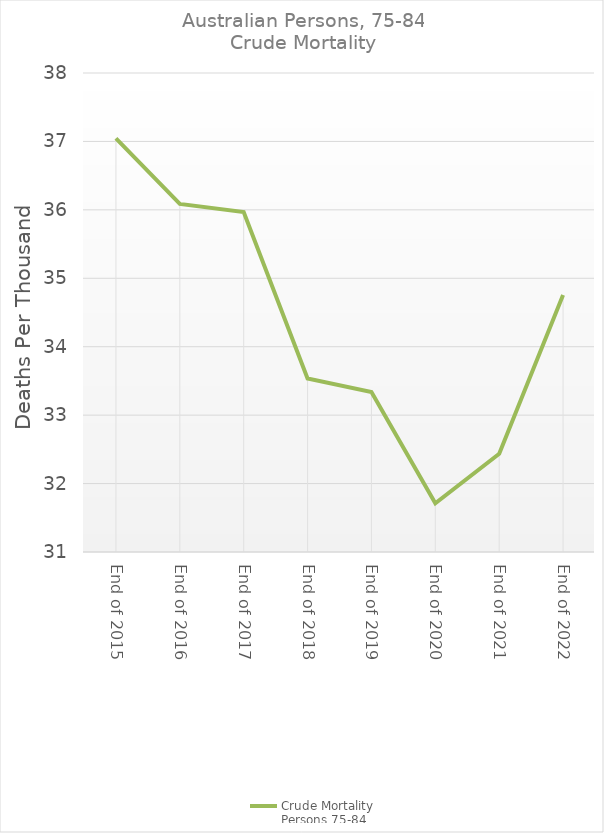
| Category | Crude Mortality
Persons 75-84 |
|---|---|
| End of 2015 | 37.043 |
| End of 2016 | 36.087 |
| End of 2017 | 35.969 |
| End of 2018 | 33.535 |
| End of 2019 | 33.338 |
| End of 2020 | 31.712 |
| End of 2021 | 32.436 |
| End of 2022 | 34.755 |